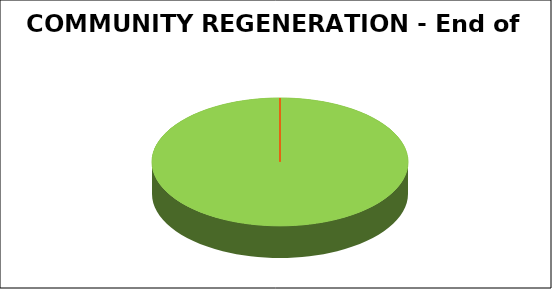
| Category | Series 0 |
|---|---|
| Green | 0.879 |
| Amber | 0 |
| Red | 0 |